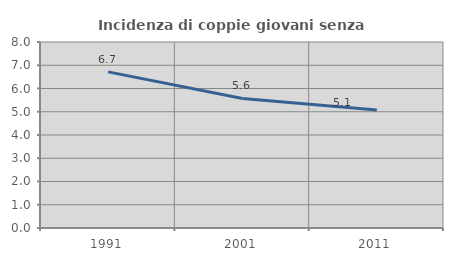
| Category | Incidenza di coppie giovani senza figli |
|---|---|
| 1991.0 | 6.716 |
| 2001.0 | 5.573 |
| 2011.0 | 5.08 |